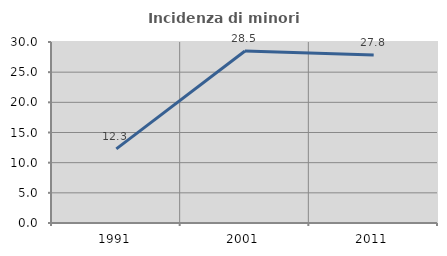
| Category | Incidenza di minori stranieri |
|---|---|
| 1991.0 | 12.281 |
| 2001.0 | 28.501 |
| 2011.0 | 27.841 |